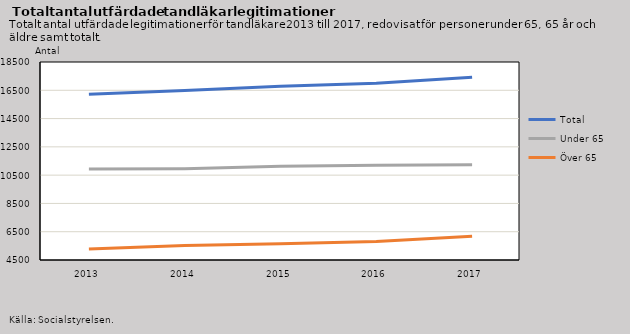
| Category | Total | Under 65 | Över 65 |
|---|---|---|---|
| 2013.0 | 16215 | 10931 | 5284 |
| 2014.0 | 16483 | 10960 | 5523 |
| 2015.0 | 16783 | 11132 | 5651 |
| 2016.0 | 17000 | 11192 | 5808 |
| 2017.0 | 17420 | 11238 | 6182 |